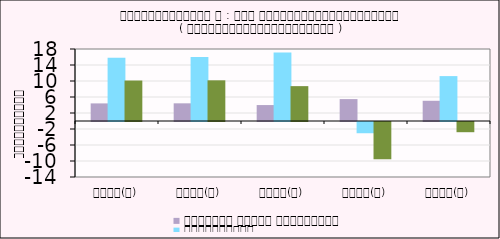
| Category | កសិកម្ម នេសាទ និងព្រៃឈើ | ឧស្សាហកម្ម | សេវាកម្ម |
|---|---|---|---|
| ២០១៧(ក) | 4.399 | 15.816 | 10.117 |
| ២០១៨(ក) | 4.417 | 15.988 | 10.172 |
| ២០១៩(ប) | 3.986 | 17.146 | 8.716 |
| ២០២០(ប) | 5.475 | -2.808 | -9.315 |
| ២០២១(ព) | 5.052 | 11.226 | -2.551 |